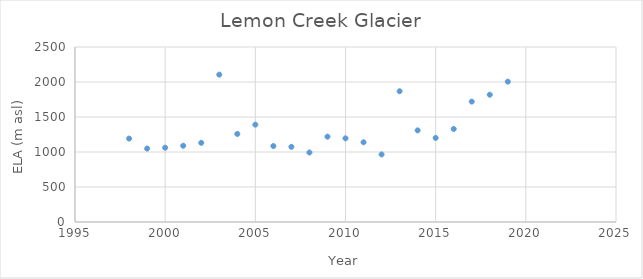
| Category | Lemon+'LCG MB'!$13:$13 Creek Glacier |
|---|---|
| 1998.0 | 1192 |
| 1999.0 | 1049 |
| 2000.0 | 1061 |
| 2001.0 | 1089 |
| 2002.0 | 1131 |
| 2003.0 | 2105 |
| 2004.0 | 1258 |
| 2005.0 | 1391 |
| 2006.0 | 1085 |
| 2007.0 | 1074 |
| 2008.0 | 993 |
| 2009.0 | 1219 |
| 2010.0 | 1195 |
| 2011.0 | 1139 |
| 2012.0 | 965 |
| 2013.0 | 1868 |
| 2014.0 | 1309 |
| 2015.0 | 1201 |
| 2016.0 | 1329 |
| 2017.0 | 1720 |
| 2018.0 | 1818 |
| 2019.0 | 2005 |